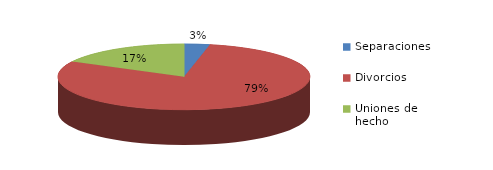
| Category | Series 0 |
|---|---|
| Separaciones | 14 |
| Divorcios | 339 |
| Uniones de hecho | 74 |